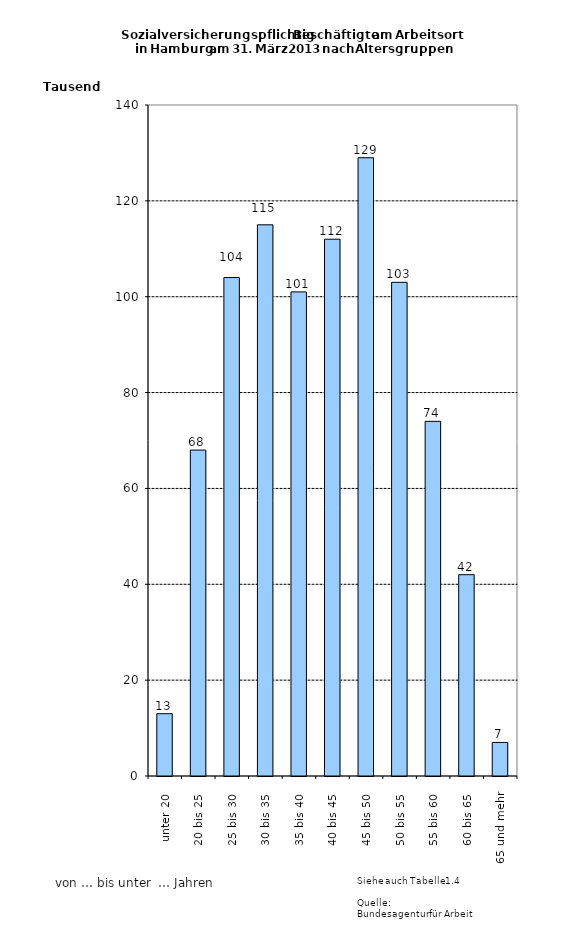
| Category | Series 0 |
|---|---|
| unter 20 | 13000 |
| 20 bis 25 | 68000 |
| 25 bis 30 | 104000 |
| 30 bis 35 | 115000 |
| 35 bis 40 | 101000 |
| 40 bis 45 | 112000 |
| 45 bis 50 | 129000 |
| 50 bis 55 | 103000 |
| 55 bis 60 | 74000 |
| 60 bis 65 | 42000 |
| 65 und mehr | 7000 |